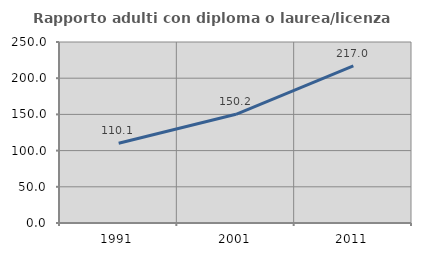
| Category | Rapporto adulti con diploma o laurea/licenza media  |
|---|---|
| 1991.0 | 110.078 |
| 2001.0 | 150.16 |
| 2011.0 | 217.037 |